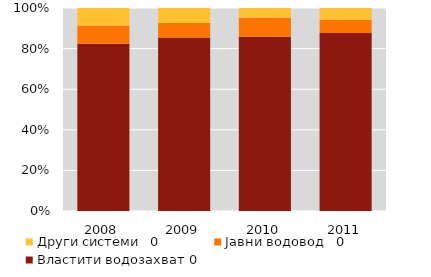
| Category | Властити водозахват 0 | Јавни водовод   0 | Други системи   0 |
|---|---|---|---|
| 2008.0 | 18804 | 2052 | 1976 |
| 2009.0 | 23540 | 1967 | 2034 |
| 2010.0 | 24475 | 2641 | 1378 |
| 2011.0 | 26320 | 1984 | 1731 |